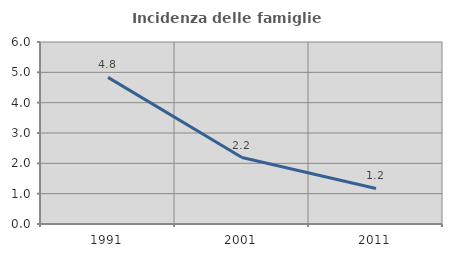
| Category | Incidenza delle famiglie numerose |
|---|---|
| 1991.0 | 4.833 |
| 2001.0 | 2.19 |
| 2011.0 | 1.173 |